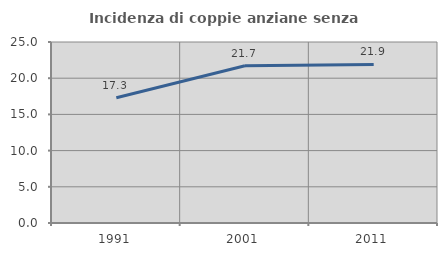
| Category | Incidenza di coppie anziane senza figli  |
|---|---|
| 1991.0 | 17.308 |
| 2001.0 | 21.711 |
| 2011.0 | 21.898 |